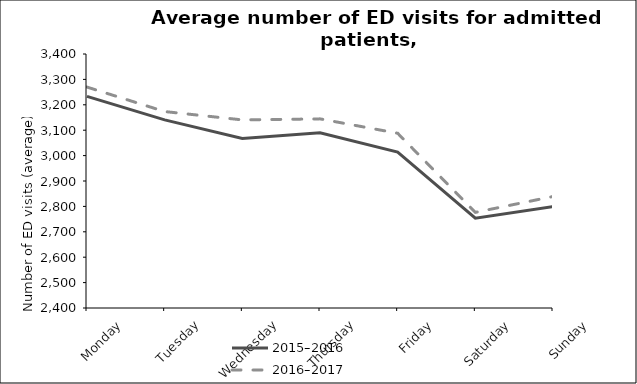
| Category | 2015–2016 | 2016–2017 |
|---|---|---|
| Monday | 3232.981 | 3269.769 |
| Tuesday | 3140.712 | 3173.423 |
| Wednesday | 3067.038 | 3140.519 |
| Thursday | 3090.019 | 3144.615 |
| Friday | 3014.135 | 3087.925 |
| Saturday | 2753.481 | 2776.519 |
| Sunday | 2799.442 | 2838.962 |